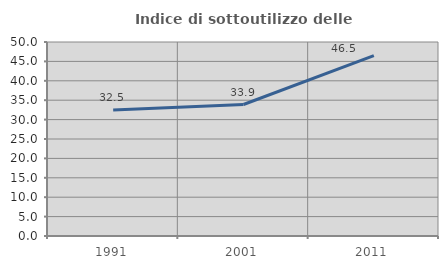
| Category | Indice di sottoutilizzo delle abitazioni  |
|---|---|
| 1991.0 | 32.491 |
| 2001.0 | 33.887 |
| 2011.0 | 46.497 |